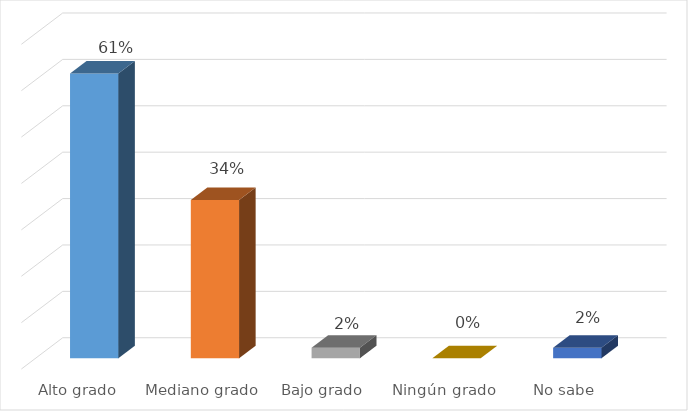
| Category | Series 0 |
|---|---|
| Alto grado  | 0.614 |
| Mediano grado | 0.341 |
| Bajo grado | 0.023 |
| Ningún grado | 0 |
| No sabe | 0.023 |